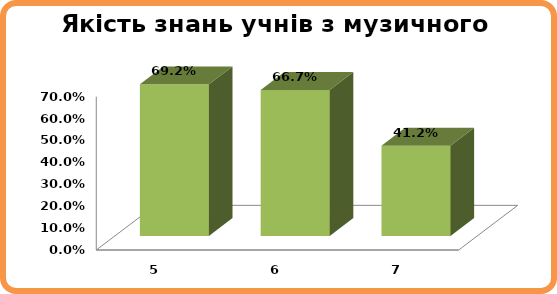
| Category | Series 0 |
|---|---|
| 5.0 | 0.692 |
| 6.0 | 0.667 |
| 7.0 | 0.412 |